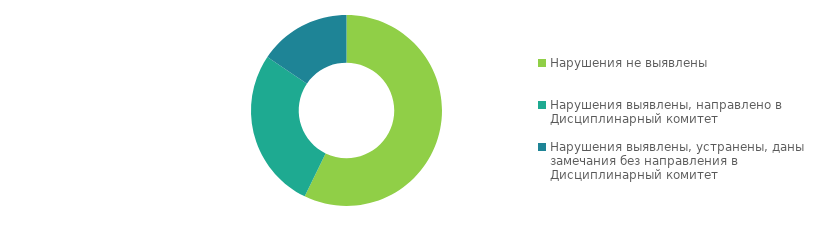
| Category | Series 0 |
|---|---|
| Нарушения не выявлены | 254 |
| Нарушения выявлены, направлено в Дисциплинарный комитет | 121 |
| Нарушения выявлены, устранены, даны замечания без направления в Дисциплинарный комитет | 69 |